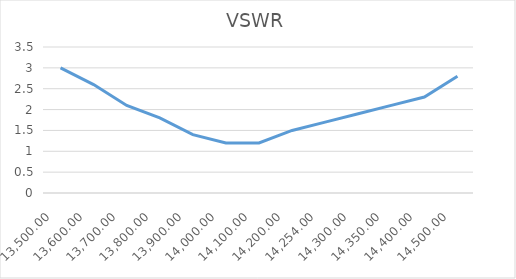
| Category | VSWR |
|---|---|
| 13500.0 | 3 |
| 13600.0 | 2.6 |
| 13700.0 | 2.1 |
| 13800.0 | 1.8 |
| 13900.0 | 1.4 |
| 14000.0 | 1.2 |
| 14100.0 | 1.2 |
| 14200.0 | 1.5 |
| 14254.0 | 1.7 |
| 14300.0 | 1.9 |
| 14350.0 | 2.1 |
| 14400.0 | 2.3 |
| 14500.0 | 2.8 |